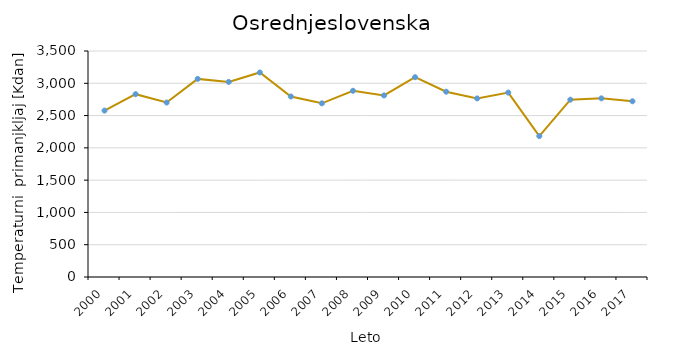
| Category | Osrednjeslovenska |
|---|---|
| 2000.0 | 2577.3 |
| 2001.0 | 2831.1 |
| 2002.0 | 2702 |
| 2003.0 | 3068.2 |
| 2004.0 | 3021.2 |
| 2005.0 | 3167.4 |
| 2006.0 | 2795.7 |
| 2007.0 | 2689.7 |
| 2008.0 | 2883.8 |
| 2009.0 | 2812.2 |
| 2010.0 | 3094.2 |
| 2011.0 | 2869.5 |
| 2012.0 | 2765.7 |
| 2013.0 | 2855.9 |
| 2014.0 | 2182.3 |
| 2015.0 | 2745.9 |
| 2016.0 | 2766.6 |
| 2017.0 | 2721.3 |